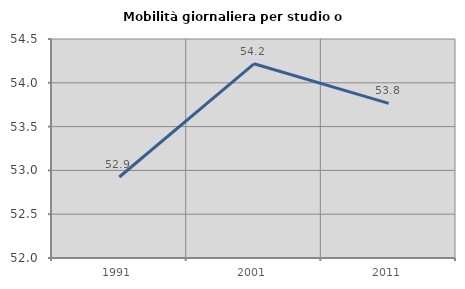
| Category | Mobilità giornaliera per studio o lavoro |
|---|---|
| 1991.0 | 52.925 |
| 2001.0 | 54.217 |
| 2011.0 | 53.765 |